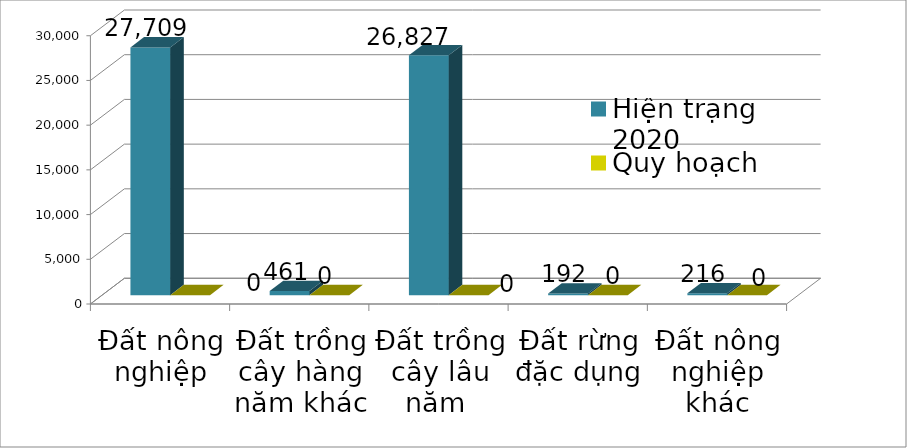
| Category | Hiện trạng 2020 | Quy hoạch 2030 |
|---|---|---|
| Đất nông nghiệp | 27708.773 | 0 |
| Đất trồng cây hàng năm khác | 460.592 | 0 |
| Đất trồng cây lâu năm  | 26827.302 | 0 |
| Đất rừng đặc dụng | 192.43 | 0 |
| Đất nông nghiệp khác | 215.964 | 0 |